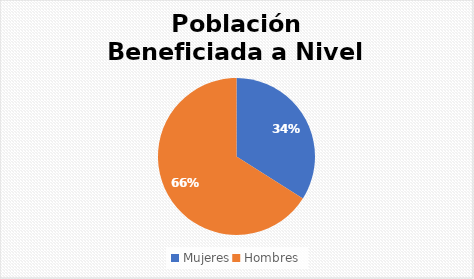
| Category | Series 0 |
|---|---|
| Mujeres | 35 |
| Hombres | 68 |